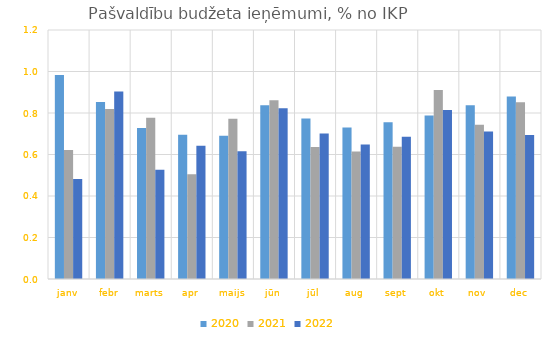
| Category | 2020 | 2021 | 2022 |
|---|---|---|---|
| janv | 0.983 | 0.622 | 0.482 |
| febr | 0.853 | 0.819 | 0.903 |
| marts | 0.727 | 0.777 | 0.526 |
| apr | 0.695 | 0.505 | 0.642 |
| maijs | 0.69 | 0.772 | 0.616 |
| jūn | 0.838 | 0.861 | 0.823 |
| jūl | 0.773 | 0.636 | 0.701 |
| aug | 0.73 | 0.614 | 0.648 |
| sept | 0.756 | 0.638 | 0.686 |
| okt | 0.788 | 0.911 | 0.814 |
| nov | 0.838 | 0.743 | 0.71 |
| dec | 0.88 | 0.851 | 0.694 |